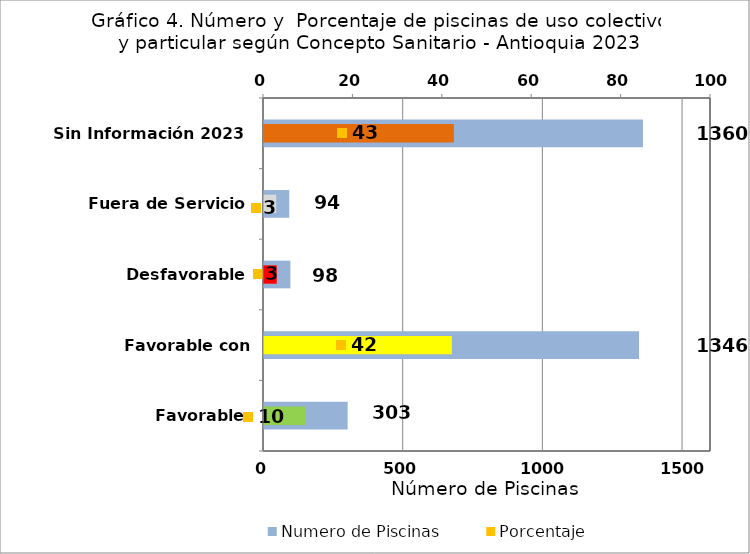
| Category | Numero de Piscinas |
|---|---|
| Favorable | 303 |
| Favorable con Requerimientos | 1346 |
| Desfavorable | 98 |
| Fuera de Servicio | 94 |
| Sin Información 2023 | 1360 |